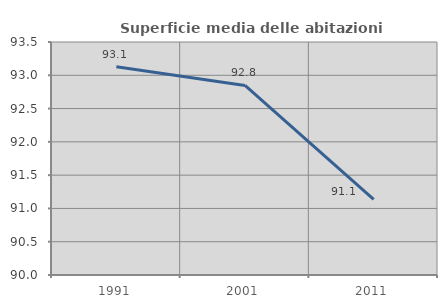
| Category | Superficie media delle abitazioni occupate |
|---|---|
| 1991.0 | 93.13 |
| 2001.0 | 92.847 |
| 2011.0 | 91.137 |